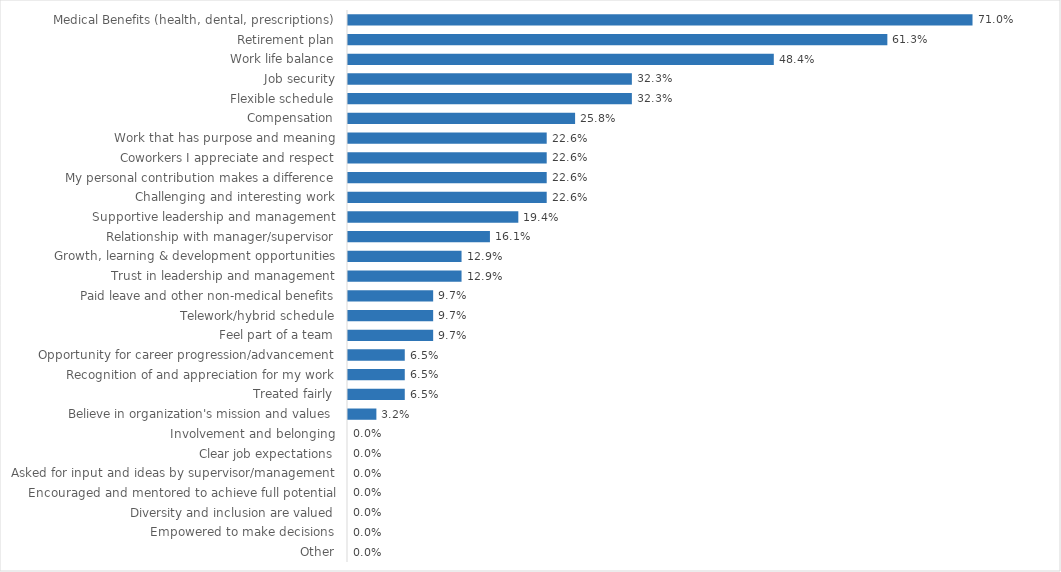
| Category | Liquor & Lottery |
|---|---|
| Medical Benefits (health, dental, prescriptions) | 0.71 |
| Retirement plan | 0.613 |
| Work life balance | 0.484 |
| Job security | 0.323 |
| Flexible schedule | 0.323 |
| Compensation | 0.258 |
| Work that has purpose and meaning | 0.226 |
| Coworkers I appreciate and respect | 0.226 |
| My personal contribution makes a difference | 0.226 |
| Challenging and interesting work | 0.226 |
| Supportive leadership and management | 0.194 |
| Relationship with manager/supervisor | 0.161 |
| Growth, learning & development opportunities | 0.129 |
| Trust in leadership and management | 0.129 |
| Paid leave and other non-medical benefits | 0.097 |
| Telework/hybrid schedule | 0.097 |
| Feel part of a team | 0.097 |
| Opportunity for career progression/advancement | 0.065 |
| Recognition of and appreciation for my work | 0.065 |
| Treated fairly | 0.065 |
| Believe in organization's mission and values | 0.032 |
| Involvement and belonging | 0 |
| Clear job expectations | 0 |
| Asked for input and ideas by supervisor/management | 0 |
| Encouraged and mentored to achieve full potential | 0 |
| Diversity and inclusion are valued | 0 |
| Empowered to make decisions | 0 |
| Other | 0 |